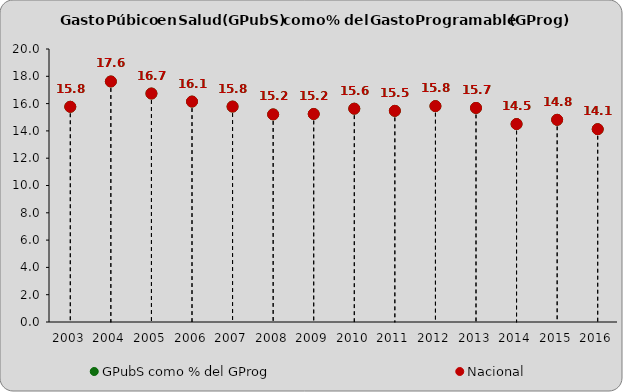
| Category | GPubS como % del GProg | Nacional |
|---|---|---|
| 2003.0 | 15.768 | 15.768 |
| 2004.0 | 17.62 | 17.62 |
| 2005.0 | 16.738 | 16.738 |
| 2006.0 | 16.148 | 16.148 |
| 2007.0 | 15.783 | 15.783 |
| 2008.0 | 15.209 | 15.209 |
| 2009.0 | 15.24 | 15.24 |
| 2010.0 | 15.628 | 15.628 |
| 2011.0 | 15.469 | 15.469 |
| 2012.0 | 15.816 | 15.816 |
| 2013.0 | 15.683 | 15.683 |
| 2014.0 | 14.503 | 14.503 |
| 2015.0 | 14.813 | 14.813 |
| 2016.0 | 14.126 | 14.126 |